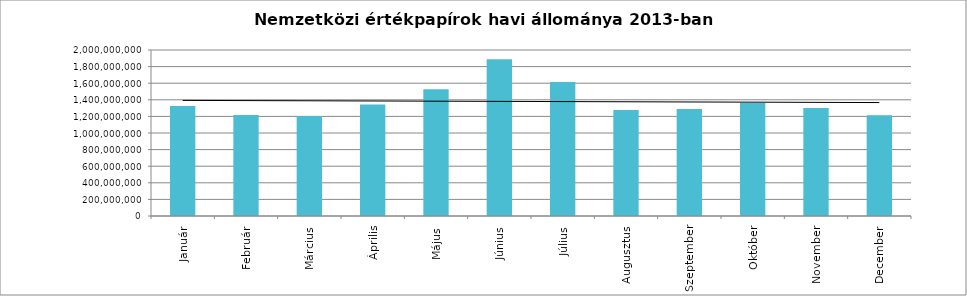
| Category | Series 0 |
|---|---|
| Január | 1326590120.34 |
| Február | 1216079322.1 |
| Március | 1204046552.1 |
| Április | 1341913098.66 |
| Május | 1526164786.48 |
| Június | 1888120702.67 |
| Július | 1613235085.56 |
| Augusztus | 1277663911.9 |
| Szeptember | 1287899058.22 |
| Október | 1360665675.46 |
| November | 1301511583.08 |
| December | 1212570339.548 |